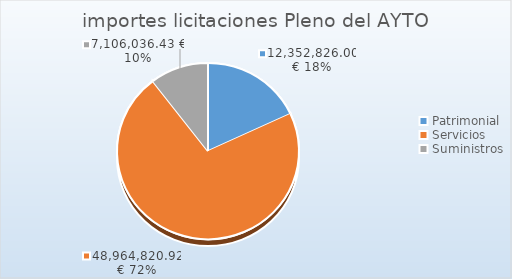
| Category | Series 0 |
|---|---|
| Patrimonial | 12352826 |
| Servicios | 48964820.92 |
| Suministros | 7106036.43 |